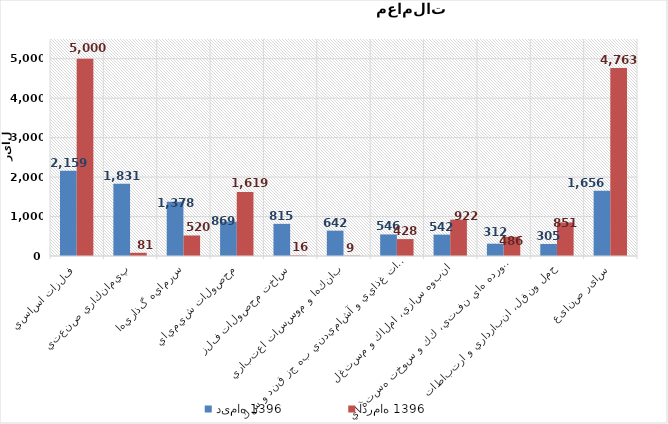
| Category | دی‌ماه 1396 | آذر‌ماه 1396 |
|---|---|---|
| فلزات اساسي | 2159.085 | 5000.298 |
| پيمانكاري صنعتي | 1830.746 | 81.315 |
| سرمايه گذاريها | 1377.799 | 519.935 |
| محصولات شيميايي | 868.571 | 1619.008 |
| ساخت محصولات فلزي | 815.126 | 15.972 |
| بانكها و موسسات اعتباري | 642.439 | 9.242 |
| محصولات غذايي و آشاميدني به جز قند و شكر | 546.385 | 428.238 |
| انبوه سازي، املاك و مستغلات | 541.59 | 922.21 |
| فراورده هاي نفتي، كك و سوخت هسته اي | 311.577 | 485.591 |
| حمل ونقل، انبارداري و ارتباطات | 305.112 | 851.149 |
| سایر صنایع | 1656.043 | 4763.25 |